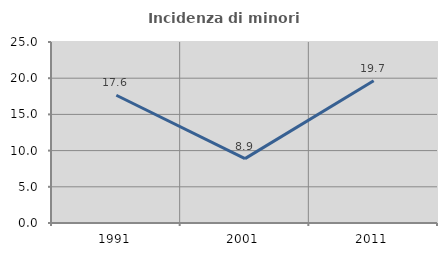
| Category | Incidenza di minori stranieri |
|---|---|
| 1991.0 | 17.647 |
| 2001.0 | 8.889 |
| 2011.0 | 19.653 |